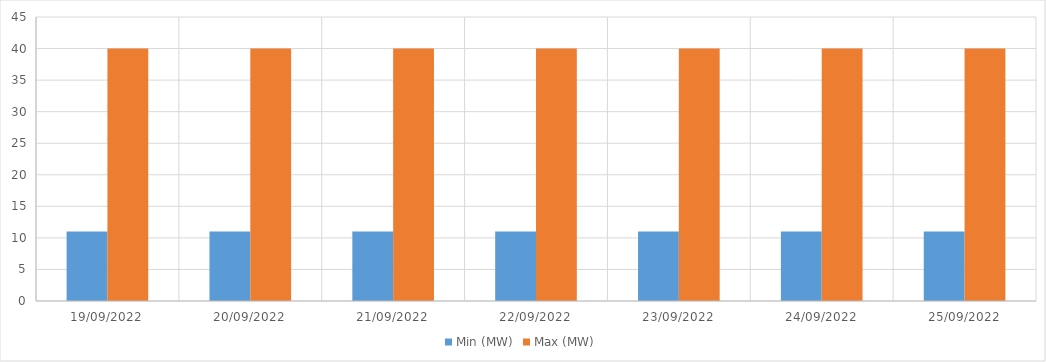
| Category | Min (MW) | Max (MW) |
|---|---|---|
| 19/09/2022 | 11 | 40 |
| 20/09/2022 | 11 | 40 |
| 21/09/2022 | 11 | 40 |
| 22/09/2022 | 11 | 40 |
| 23/09/2022 | 11 | 40 |
| 24/09/2022 | 11 | 40 |
| 25/09/2022 | 11 | 40 |